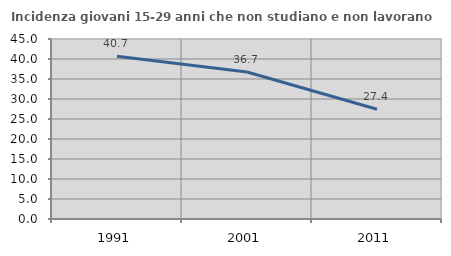
| Category | Incidenza giovani 15-29 anni che non studiano e non lavorano  |
|---|---|
| 1991.0 | 40.708 |
| 2001.0 | 36.735 |
| 2011.0 | 27.445 |